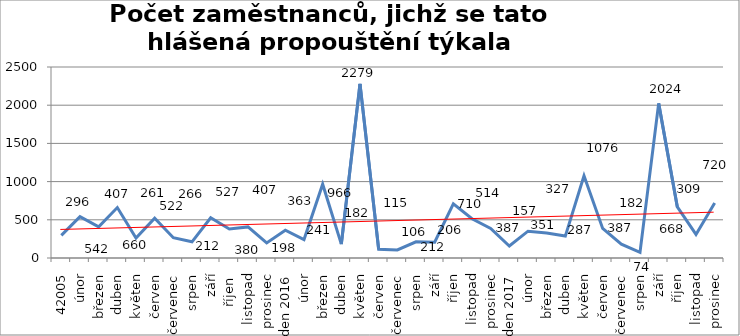
| Category | Series 0 |
|---|---|
| 42005 | 296 |
| únor | 542 |
| březen | 407 |
| duben | 660 |
| květen | 261 |
| červen | 522 |
| červenec | 266 |
| srpen | 212 |
| září | 527 |
| říjen  | 380 |
| listopad | 407 |
| prosinec | 198 |
|  leden 2016 | 363 |
| únor | 241 |
| březen | 966 |
| duben | 182 |
| květen | 2279 |
| červen | 115 |
| červenec | 106 |
| srpen | 212 |
| září | 206 |
| říjen | 710 |
| listopad | 514 |
| prosinec | 387 |
|  leden 2017 | 157 |
| únor | 351 |
| březen | 327 |
| duben | 287 |
| květen | 1076 |
| červen | 387 |
| červenec | 182 |
| srpen | 74 |
| září | 2024 |
| říjen | 668 |
| listopad | 309 |
| prosinec | 720 |